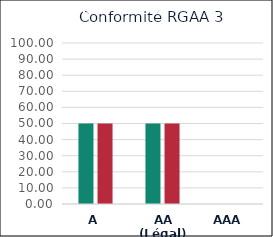
| Category | Series 0 | Series 1 |
|---|---|---|
| A | 50 | 50 |
| AA (Légal) | 50 | 50 |
| AAA | 0 | 0 |